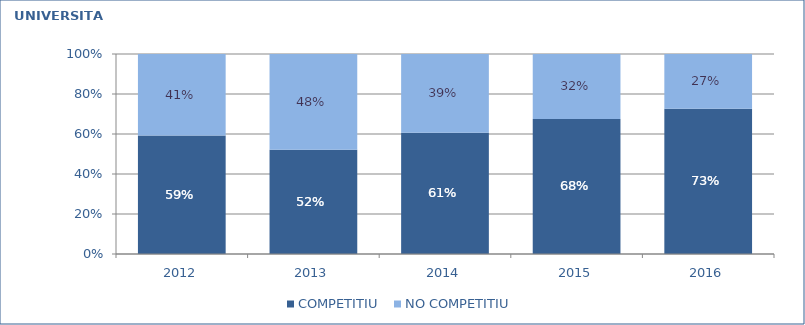
| Category | COMPETITIU  | NO COMPETITIU |
|---|---|---|
| 2012.0 | 0.593 | 0.407 |
| 2013.0 | 0.522 | 0.478 |
| 2014.0 | 0.607 | 0.393 |
| 2015.0 | 0.676 | 0.324 |
| 2016.0 | 0.727 | 0.273 |